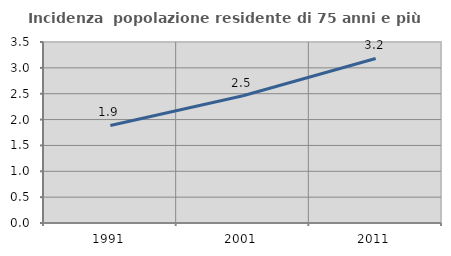
| Category | Incidenza  popolazione residente di 75 anni e più |
|---|---|
| 1991.0 | 1.887 |
| 2001.0 | 2.46 |
| 2011.0 | 3.182 |